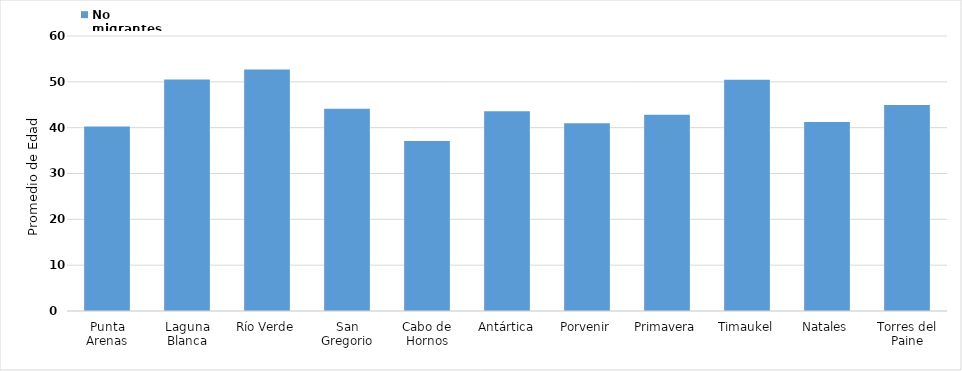
| Category | No migrantes |
|---|---|
| Punta Arenas | 40.237 |
| Laguna Blanca | 50.536 |
| Río Verde | 52.698 |
| San Gregorio | 44.112 |
| Cabo de Hornos | 37.073 |
| Antártica | 43.571 |
| Porvenir | 40.983 |
| Primavera | 42.839 |
| Timaukel | 50.46 |
| Natales | 41.221 |
| Torres del Paine | 44.93 |